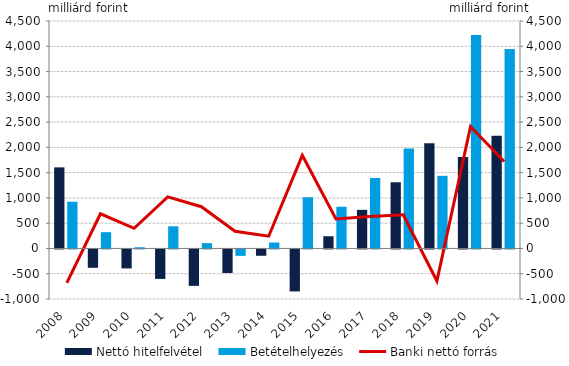
| Category | Nettó hitelfelvétel | Betételhelyezés |
|---|---|---|
| 2008.0 | 1604.117 | 924.526 |
| 2009.0 | -363.024 | 322.449 |
| 2010.0 | -375.15 | 23.517 |
| 2011.0 | -582.414 | 439.017 |
| 2012.0 | -720.502 | 104.961 |
| 2013.0 | -466.305 | -126.817 |
| 2014.0 | -125.073 | 117.279 |
| 2015.0 | -830.803 | 1012.037 |
| 2016.0 | 241.811 | 825.492 |
| 2017.0 | 763.636 | 1393.586 |
| 2018.0 | 1309.413 | 1976.26 |
| 2019.0 | 2081.059 | 1436.854 |
| 2020.0 | 1809.581 | 4222.034 |
| 2021.0 | 2229.21 | 3947.826 |